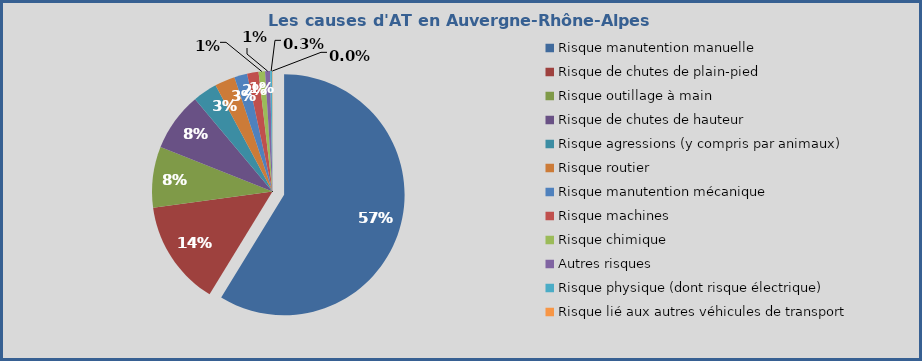
| Category | Series 0 |
|---|---|
| Risque manutention manuelle | 0.568 |
| Risque de chutes de plain-pied | 0.136 |
| Risque outillage à main | 0.079 |
| Risque de chutes de hauteur | 0.076 |
| Risque agressions (y compris par animaux) | 0.032 |
| Risque routier | 0.026 |
| Risque manutention mécanique | 0.017 |
| Risque machines | 0.015 |
| Risque chimique | 0.008 |
| Autres risques | 0.006 |
| Risque physique (dont risque électrique) | 0.003 |
| Risque lié aux autres véhicules de transport | 0 |